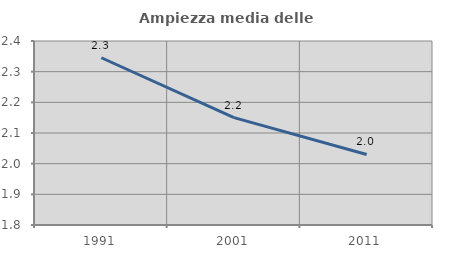
| Category | Ampiezza media delle famiglie |
|---|---|
| 1991.0 | 2.345 |
| 2001.0 | 2.15 |
| 2011.0 | 2.03 |